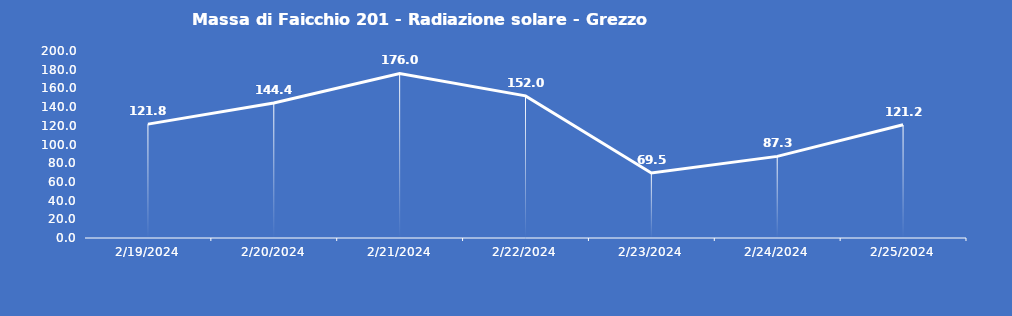
| Category | Massa di Faicchio 201 - Radiazione solare - Grezzo (W/m2) |
|---|---|
| 2/19/24 | 121.8 |
| 2/20/24 | 144.4 |
| 2/21/24 | 176 |
| 2/22/24 | 152 |
| 2/23/24 | 69.5 |
| 2/24/24 | 87.3 |
| 2/25/24 | 121.2 |